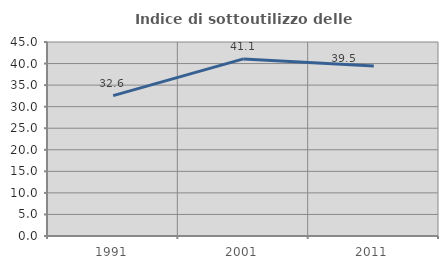
| Category | Indice di sottoutilizzo delle abitazioni  |
|---|---|
| 1991.0 | 32.569 |
| 2001.0 | 41.074 |
| 2011.0 | 39.453 |